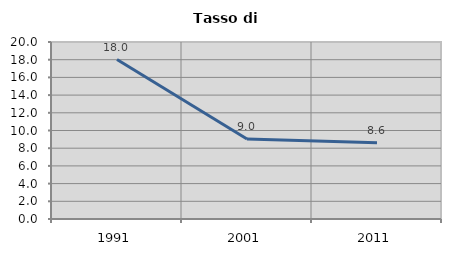
| Category | Tasso di disoccupazione   |
|---|---|
| 1991.0 | 18.014 |
| 2001.0 | 9.045 |
| 2011.0 | 8.622 |